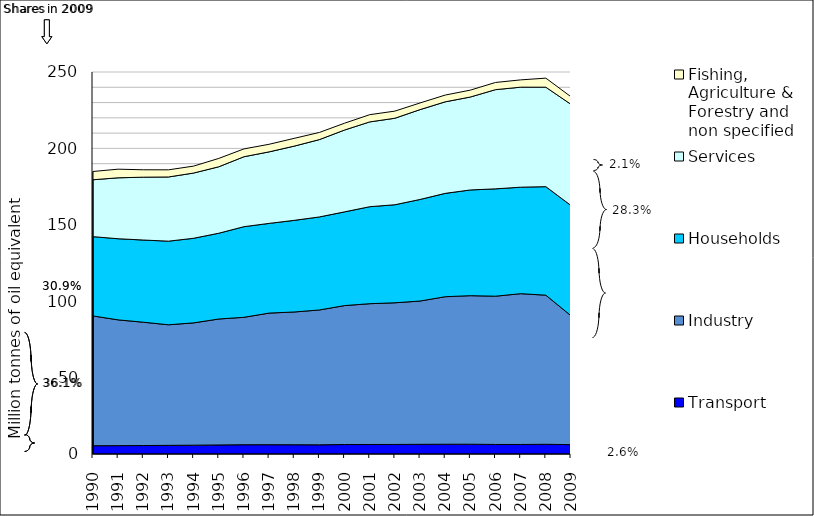
| Category | Transport | Industry | Households | Services | Fishing, Agriculture & Forestry and non specified |
|---|---|---|---|---|---|
| 1990.0 | 5.414 | 84.927 | 51.908 | 37.236 | 5.41 |
| 1991.0 | 5.477 | 82.311 | 53.088 | 39.876 | 5.648 |
| 1992.0 | 5.545 | 80.707 | 53.786 | 41.13 | 4.831 |
| 1993.0 | 5.65 | 78.923 | 54.714 | 42.006 | 4.676 |
| 1994.0 | 5.77 | 80.054 | 55.354 | 42.697 | 4.541 |
| 1995.0 | 5.922 | 82.423 | 56.138 | 43.495 | 5.465 |
| 1996.0 | 6.071 | 83.393 | 59.309 | 45.77 | 5.119 |
| 1997.0 | 6.089 | 86.128 | 58.708 | 46.804 | 4.973 |
| 1998.0 | 6.058 | 86.891 | 59.959 | 48.591 | 5.086 |
| 1999.0 | 6.002 | 88.26 | 60.891 | 50.607 | 4.679 |
| 2000.0 | 6.202 | 90.927 | 61.34 | 53.567 | 4.456 |
| 2001.0 | 6.223 | 92.149 | 63.481 | 55.49 | 4.728 |
| 2002.0 | 6.255 | 92.707 | 64.164 | 56.609 | 4.674 |
| 2003.0 | 6.335 | 93.769 | 66.477 | 58.803 | 4.349 |
| 2004.0 | 6.392 | 96.545 | 67.638 | 59.896 | 4.433 |
| 2005.0 | 6.402 | 97.206 | 69.206 | 60.82 | 4.51 |
| 2006.0 | 6.239 | 97.035 | 70.248 | 64.93 | 4.705 |
| 2007.0 | 6.235 | 98.686 | 69.685 | 65.463 | 4.767 |
| 2008.0 | 6.36 | 97.585 | 71.026 | 65.086 | 5.925 |
| 2009.0 | 6.13 | 84.35 | 72.151 | 66.204 | 4.95 |